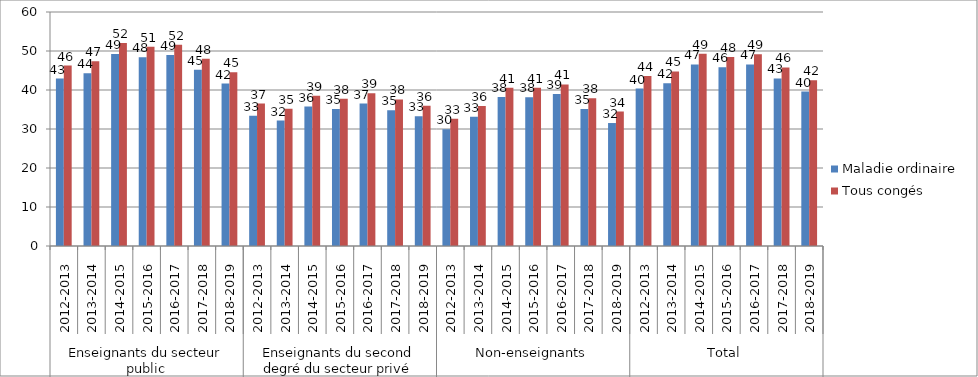
| Category | Maladie ordinaire | Tous congés |
|---|---|---|
| 0 | 42.92 | 46.27 |
| 1 | 44.29 | 47.39 |
| 2 | 49.26 | 52.07 |
| 3 | 48.38 | 51.09 |
| 4 | 49 | 51.62 |
| 5 | 45.22 | 48.04 |
| 6 | 41.64 | 44.52 |
| 7 | 33.4 | 36.51 |
| 8 | 32.16 | 35.21 |
| 9 | 35.74 | 38.51 |
| 10 | 35.14 | 37.77 |
| 11 | 36.53 | 39.17 |
| 12 | 34.8 | 37.58 |
| 13 | 33.3 | 35.96 |
| 14 | 29.93 | 32.61 |
| 15 | 33.13 | 35.88 |
| 16 | 38.19 | 40.6 |
| 17 | 38.16 | 40.59 |
| 18 | 38.96 | 41.44 |
| 19 | 35.12 | 37.9 |
| 20 | 31.53 | 34.47 |
| 21 | 40.37 | 43.61 |
| 22 | 41.72 | 44.76 |
| 23 | 46.55 | 49.31 |
| 24 | 45.82 | 48.48 |
| 25 | 46.55 | 49.15 |
| 26 | 42.97 | 45.78 |
| 27 | 39.6 | 42.47 |